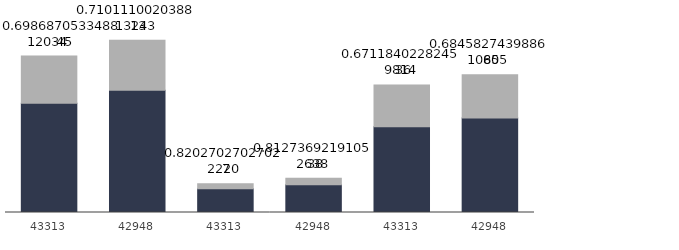
| Category |  Arbeitslose  | Personen in arbeitsmarktpolitischen Maßnahmen oder mit einem Sonderstatus  |
|---|---|---|
| 43313 | 8408 | 3626 |
| 42948 | 9404 | 3839 |
| 43313 | 1821 | 399 |
| 42948 | 2144 | 494 |
| 43313 | 6587 | 3227 |
| 42948 | 7260 | 3345 |